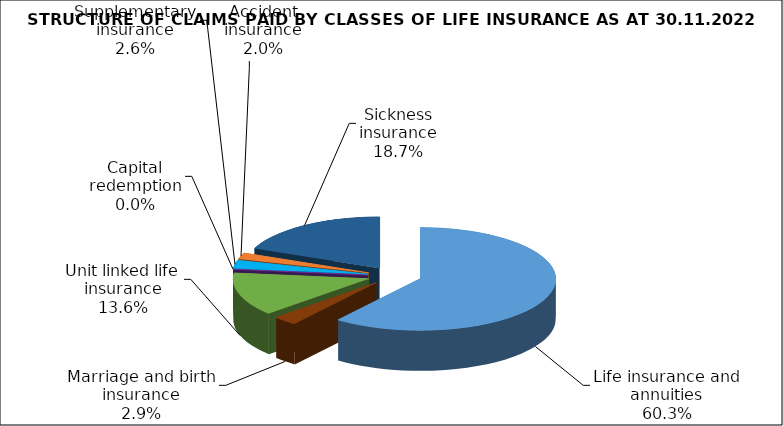
| Category | Series 0 |
|---|---|
| Life insurance and annuities | 141963794.43 |
| Marriage and birth insurance | 6850083.817 |
| Unit linked life insurance | 31996650.707 |
| Capital redemption | 0 |
| Supplementary insurance | 6025612.141 |
| Accident insurance | 4658969.864 |
| Sickness insurance | 43984295.607 |